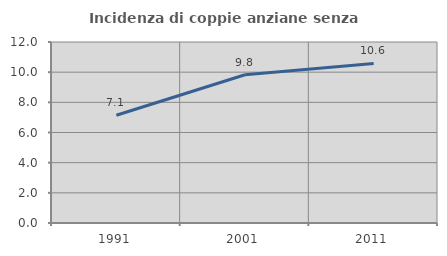
| Category | Incidenza di coppie anziane senza figli  |
|---|---|
| 1991.0 | 7.143 |
| 2001.0 | 9.829 |
| 2011.0 | 10.577 |